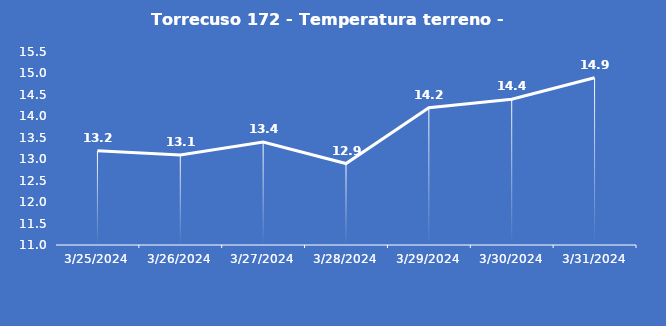
| Category | Torrecuso 172 - Temperatura terreno - Grezzo (°C) |
|---|---|
| 3/25/24 | 13.2 |
| 3/26/24 | 13.1 |
| 3/27/24 | 13.4 |
| 3/28/24 | 12.9 |
| 3/29/24 | 14.2 |
| 3/30/24 | 14.4 |
| 3/31/24 | 14.9 |